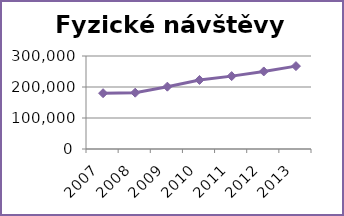
| Category | Fyzické návštěvy celkem |
|---|---|
| 2007.0 | 179991 |
| 2008.0 | 181629 |
| 2009.0 | 201092 |
| 2010.0 | 222684 |
| 2011.0 | 235101 |
| 2012.0 | 250201 |
| 2013.0 | 267349 |